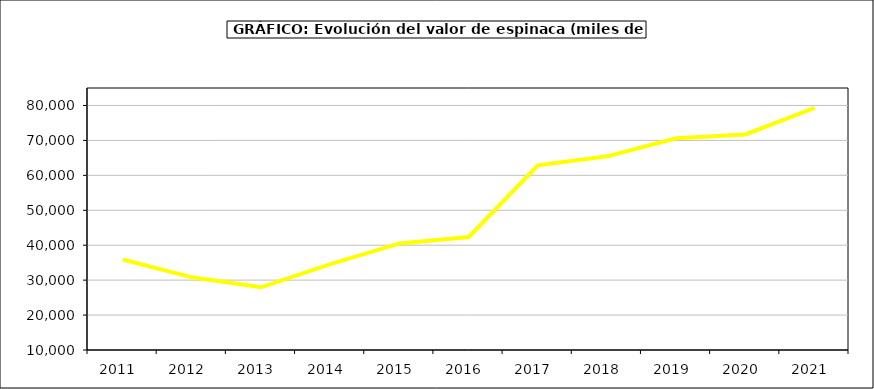
| Category | Valor |
|---|---|
| 2011.0 | 35899.468 |
| 2012.0 | 30801.916 |
| 2013.0 | 27951.792 |
| 2014.0 | 34558.726 |
| 2015.0 | 40502 |
| 2016.0 | 42355 |
| 2017.0 | 62868.236 |
| 2018.0 | 65435.978 |
| 2019.0 | 70628.986 |
| 2020.0 | 71691.2 |
| 2021.0 | 79290.147 |